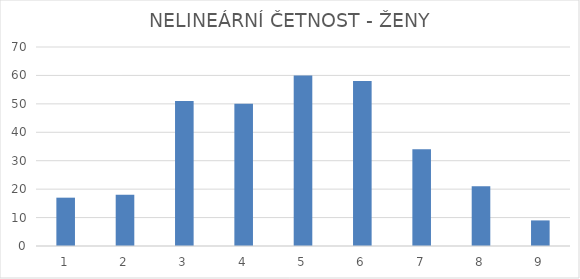
| Category | Četnost nelineární |
|---|---|
| 1.0 | 17 |
| 2.0 | 18 |
| 3.0 | 51 |
| 4.0 | 50 |
| 5.0 | 60 |
| 6.0 | 58 |
| 7.0 | 34 |
| 8.0 | 21 |
| 9.0 | 9 |